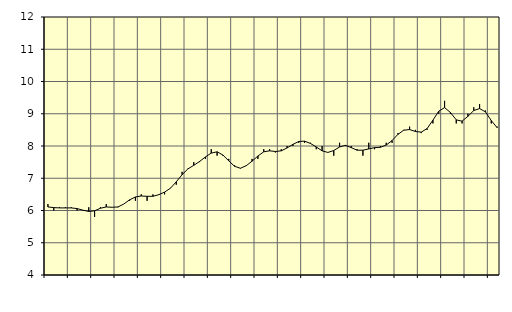
| Category | Piggar | Byggverksamhet, SNI 41-43 |
|---|---|---|
| nan | 6.2 | 6.11 |
| 1.0 | 6 | 6.09 |
| 1.0 | 6.1 | 6.08 |
| 1.0 | 6.1 | 6.08 |
| nan | 6.1 | 6.08 |
| 2.0 | 6 | 6.06 |
| 2.0 | 6 | 6.01 |
| 2.0 | 6.1 | 5.97 |
| nan | 5.8 | 5.99 |
| 3.0 | 6.1 | 6.07 |
| 3.0 | 6.2 | 6.11 |
| 3.0 | 6.1 | 6.1 |
| nan | 6.1 | 6.11 |
| 4.0 | 6.2 | 6.2 |
| 4.0 | 6.3 | 6.33 |
| 4.0 | 6.3 | 6.42 |
| nan | 6.5 | 6.45 |
| 5.0 | 6.3 | 6.44 |
| 5.0 | 6.5 | 6.44 |
| 5.0 | 6.5 | 6.49 |
| nan | 6.5 | 6.57 |
| 6.0 | 6.7 | 6.69 |
| 6.0 | 6.8 | 6.89 |
| 6.0 | 7.2 | 7.11 |
| nan | 7.3 | 7.29 |
| 7.0 | 7.5 | 7.4 |
| 7.0 | 7.5 | 7.52 |
| 7.0 | 7.6 | 7.66 |
| nan | 7.9 | 7.78 |
| 8.0 | 7.7 | 7.82 |
| 8.0 | 7.7 | 7.72 |
| 8.0 | 7.6 | 7.54 |
| nan | 7.4 | 7.37 |
| 9.0 | 7.3 | 7.31 |
| 9.0 | 7.4 | 7.39 |
| 9.0 | 7.6 | 7.53 |
| nan | 7.6 | 7.69 |
| 10.0 | 7.9 | 7.82 |
| 10.0 | 7.9 | 7.85 |
| 10.0 | 7.8 | 7.83 |
| nan | 7.9 | 7.85 |
| 11.0 | 8 | 7.94 |
| 11.0 | 8 | 8.05 |
| 11.0 | 8.1 | 8.14 |
| nan | 8.1 | 8.15 |
| 12.0 | 8.1 | 8.08 |
| 12.0 | 7.9 | 7.97 |
| 12.0 | 8 | 7.85 |
| nan | 7.8 | 7.8 |
| 13.0 | 7.7 | 7.86 |
| 13.0 | 8.1 | 7.97 |
| 13.0 | 8 | 8.02 |
| nan | 8 | 7.95 |
| 14.0 | 7.9 | 7.87 |
| 14.0 | 7.7 | 7.87 |
| 14.0 | 8.1 | 7.91 |
| nan | 7.9 | 7.95 |
| 15.0 | 8 | 7.96 |
| 15.0 | 8.1 | 8.03 |
| 15.0 | 8.1 | 8.17 |
| nan | 8.4 | 8.36 |
| 16.0 | 8.5 | 8.49 |
| 16.0 | 8.6 | 8.51 |
| 16.0 | 8.5 | 8.45 |
| nan | 8.4 | 8.43 |
| 17.0 | 8.5 | 8.54 |
| 17.0 | 8.7 | 8.8 |
| 17.0 | 9 | 9.08 |
| nan | 9.4 | 9.19 |
| 18.0 | 9 | 9.04 |
| 18.0 | 8.7 | 8.81 |
| 18.0 | 8.7 | 8.77 |
| nan | 9 | 8.92 |
| 19.0 | 9.2 | 9.1 |
| 19.0 | 9.3 | 9.16 |
| 19.0 | 9.1 | 9.06 |
| nan | 8.7 | 8.79 |
| 20.0 | 8.6 | 8.57 |